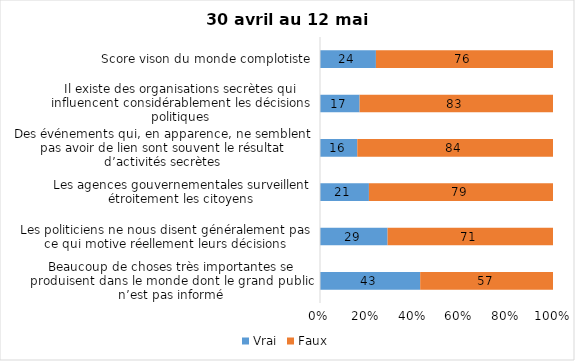
| Category | Vrai | Faux |
|---|---|---|
| Beaucoup de choses très importantes se produisent dans le monde dont le grand public n’est pas informé | 43 | 57 |
| Les politiciens ne nous disent généralement pas ce qui motive réellement leurs décisions | 29 | 71 |
| Les agences gouvernementales surveillent étroitement les citoyens | 21 | 79 |
| Des événements qui, en apparence, ne semblent pas avoir de lien sont souvent le résultat d’activités secrètes | 16 | 84 |
| Il existe des organisations secrètes qui influencent considérablement les décisions politiques | 17 | 83 |
| Score vison du monde complotiste | 24 | 76 |